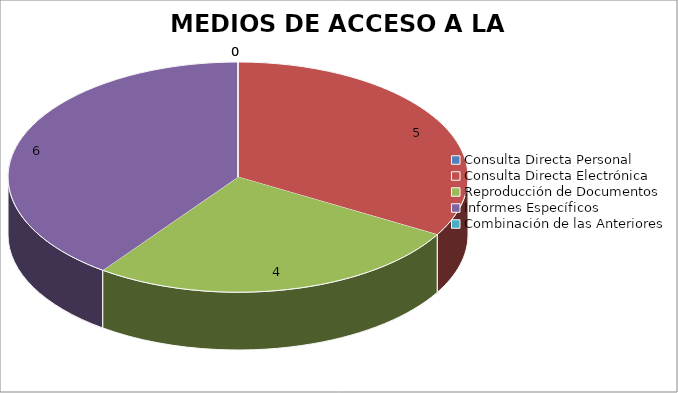
| Category | MEDIOS DE ACCESO A LA INFORMACIÓN |
|---|---|
| 0 | 0 |
| 1 | 5 |
| 2 | 4 |
| 3 | 6 |
| 4 | 0 |